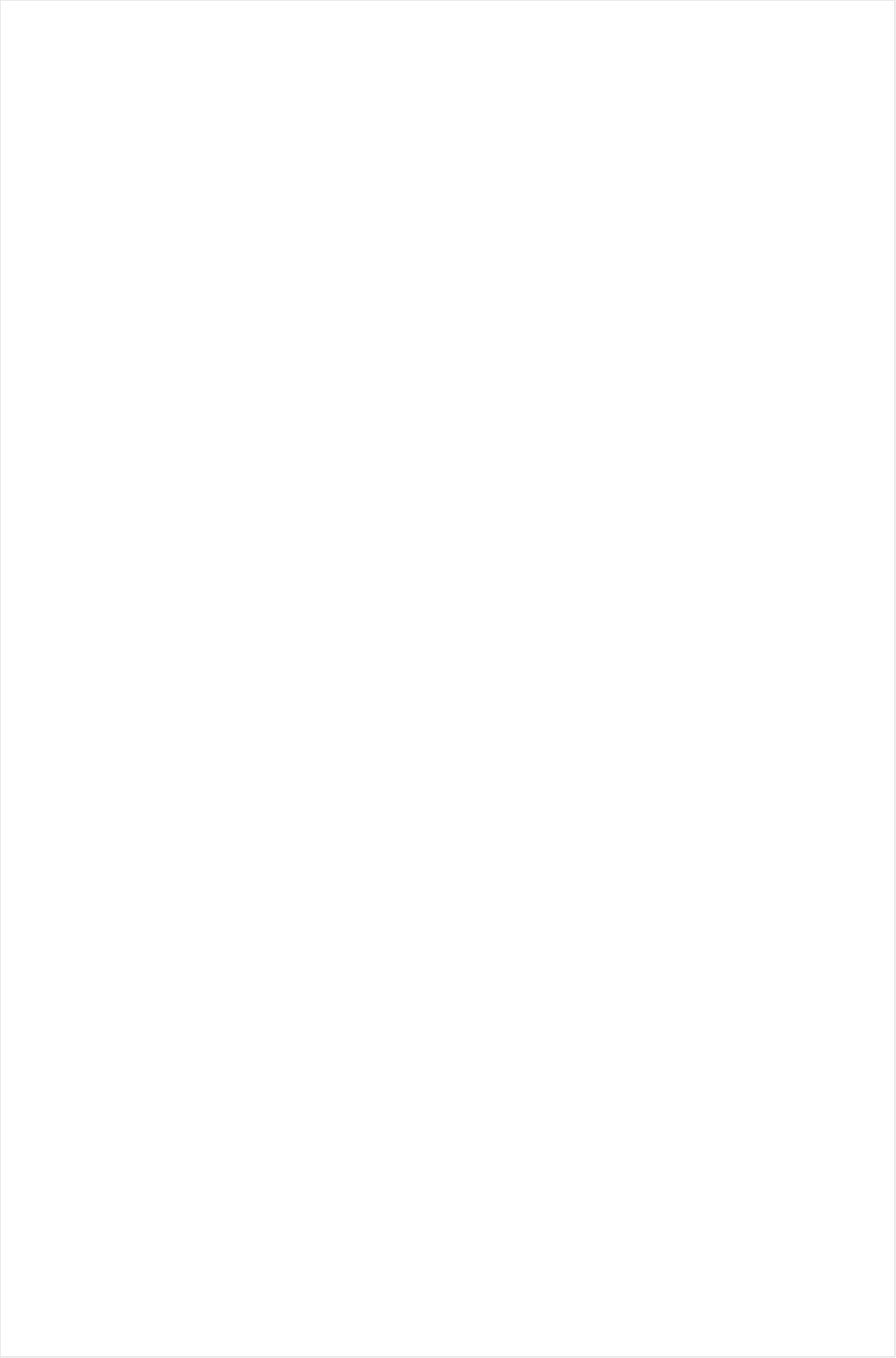
| Category | Total |
|---|---|
| Galavision | -0.839 |
| UniMas | -0.813 |
| Univision | -0.801 |
| Telemundo | -0.739 |
| TUDN | -0.712 |
| NBC Universo | -0.706 |
| ESPN Deportes | -0.699 |
| Cartoon Network | -0.429 |
| Nick Toons | -0.294 |
| Travel | -0.265 |
| Adult Swim | -0.248 |
| Logo | -0.247 |
| Discovery Life Channel | -0.237 |
| Lifetime Movies | -0.224 |
| Nick | -0.204 |
| Disney Channel | -0.2 |
| Disney XD | -0.166 |
| Investigation Discovery | -0.162 |
| VH1 | -0.153 |
| Nick Jr. | -0.152 |
| TLC | -0.136 |
| INSP | -0.133 |
| Hallmark Movies & Mysteries | -0.13 |
| Teen Nick | -0.129 |
| OXYGEN | -0.121 |
| Nick@Nite | -0.119 |
| UP TV | -0.118 |
| National Geographic Wild | -0.118 |
| WE TV | -0.114 |
| Headline News | -0.109 |
| Lifetime | -0.097 |
| Science Channel | -0.094 |
| ION | -0.093 |
| Oprah Winfrey Network | -0.076 |
| Hallmark | -0.073 |
| BET | -0.073 |
| Universal Kids | -0.072 |
| CMTV | -0.067 |
| Disney Junior US | -0.06 |
| Weather Channel | -0.059 |
| Animal Planet | -0.053 |
| CW | -0.052 |
| E! | -0.049 |
| A&E | -0.024 |
| Motor Trend Network | -0.023 |
| SYFY | 0.012 |
| History Channel | 0.015 |
| MyNetworkTV | 0.016 |
| BET Her | 0.016 |
| MTV | 0.017 |
| Discovery Family Channel | 0.021 |
| TV ONE | 0.028 |
| MTV2 | 0.044 |
| Ovation | 0.046 |
| Discovery Channel | 0.047 |
| FYI | 0.052 |
| TV LAND | 0.052 |
| FX | 0.056 |
| Reelz Channel | 0.06 |
| FOX | 0.064 |
| Great American Country | 0.071 |
| USA Network | 0.079 |
| American Heroes Channel | 0.081 |
| FXX | 0.086 |
| RFD TV | 0.092 |
| BRAVO | 0.093 |
| National Geographic | 0.094 |
| FXDEP | 0.096 |
| Paramount Network | 0.098 |
| SundanceTV | 0.125 |
| Freeform | 0.126 |
| POP | 0.129 |
| HGTV | 0.131 |
| MSNBC | 0.132 |
| WGN America | 0.139 |
| Fox Business | 0.157 |
| ABC | 0.161 |
| PBS | 0.161 |
| Game Show | 0.172 |
| AMC | 0.174 |
| FX Movie Channel | 0.177 |
| Food Network | 0.178 |
| Fox News | 0.182 |
| Destination America | 0.182 |
| NBC | 0.182 |
| Viceland | 0.193 |
| TBS | 0.196 |
| Smithsonian | 0.206 |
| truTV | 0.211 |
| CNN | 0.227 |
| Cooking Channel | 0.247 |
| TNT | 0.251 |
| CBS | 0.252 |
| Outdoor Channel | 0.263 |
| BBC America | 0.263 |
| Bloomberg HD | 0.274 |
| DIY | 0.274 |
| Comedy Central | 0.284 |
| CNBC | 0.296 |
| The Sportsman Channel | 0.321 |
| Independent Film (IFC) | 0.36 |
| Tennis Channel | 0.393 |
| Olympic Channel | 0.585 |
| NHL | 0.652 |
| Fox Sports 1 | 0.683 |
| NFL Network | 0.762 |
| CBS Sports | 0.836 |
| NBC Sports | 0.841 |
| ESPNEWS | 0.945 |
| Golf | 0.947 |
| MLB Network | 0.972 |
| PAC-12 Network | 1.066 |
| NBA TV | 1.096 |
| ESPN | 1.184 |
| ESPN2 | 1.188 |
| ESPNU | 1.248 |
| Big Ten Network | 1.45 |